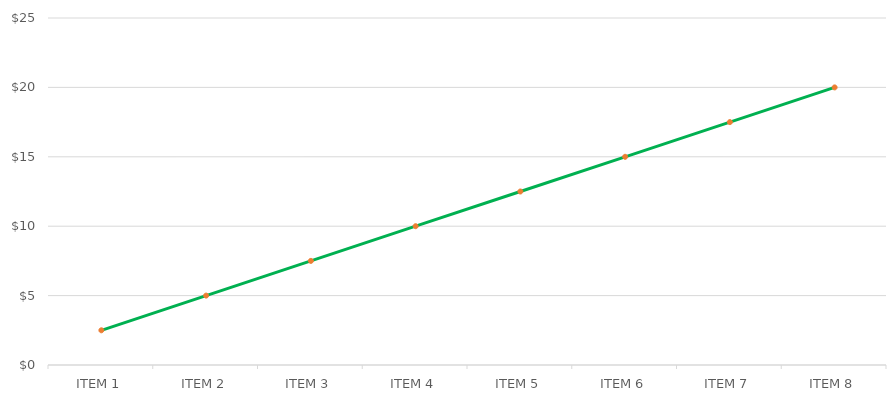
| Category | Series 1 |
|---|---|
| ITEM 1 | 2.5 |
| ITEM 2 | 5 |
| ITEM 3 | 7.5 |
| ITEM 4 | 10 |
| ITEM 5 | 12.5 |
| ITEM 6 | 15 |
| ITEM 7 | 17.5 |
| ITEM 8 | 20 |